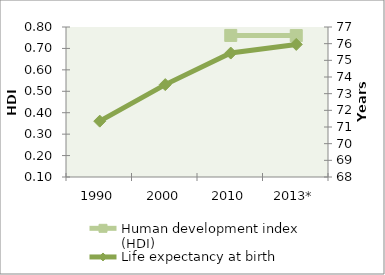
| Category | Human development index (HDI) |
|---|---|
| 1990 | 0 |
| 2000 | 0 |
| 2010 | 0.761 |
| 2013* | 0.76 |